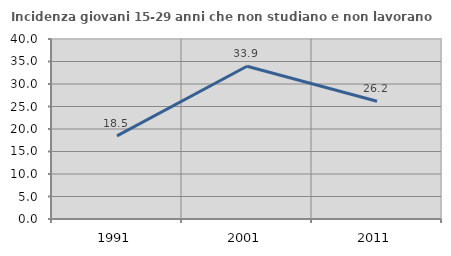
| Category | Incidenza giovani 15-29 anni che non studiano e non lavorano  |
|---|---|
| 1991.0 | 18.469 |
| 2001.0 | 33.945 |
| 2011.0 | 26.168 |